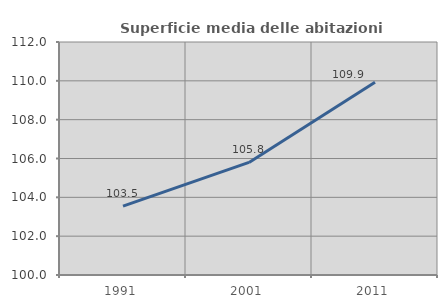
| Category | Superficie media delle abitazioni occupate |
|---|---|
| 1991.0 | 103.548 |
| 2001.0 | 105.798 |
| 2011.0 | 109.923 |